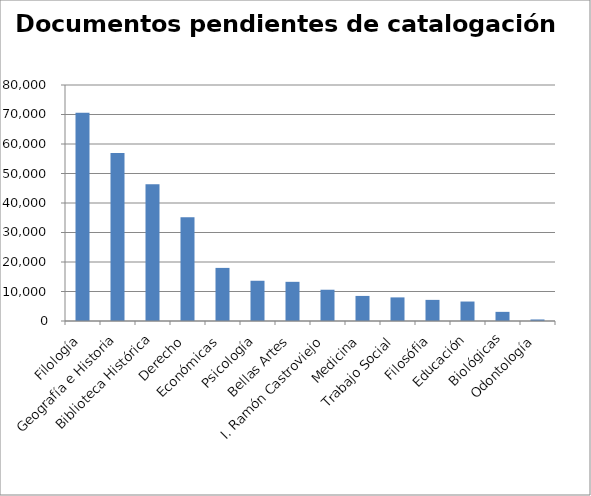
| Category | Series 0 |
|---|---|
| Filología | 70564 |
| Geografía e Historia | 56925 |
| Biblioteca Histórica | 46355 |
| Derecho | 35141 |
| Económicas | 18000 |
| Psicología | 13641 |
| Bellas Artes | 13279 |
| I. Ramón Castroviejo | 10600 |
| Medicina | 8500 |
| Trabajo Social | 8000 |
| Filosófia | 7160 |
| Educación | 6600 |
| Biológicas | 3100 |
| Odontología | 519 |